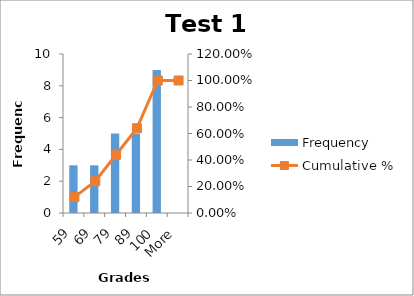
| Category | Frequency |
|---|---|
| 59 | 3 |
| 69 | 3 |
| 79 | 5 |
| 89 | 5 |
| 100 | 9 |
| More | 0 |